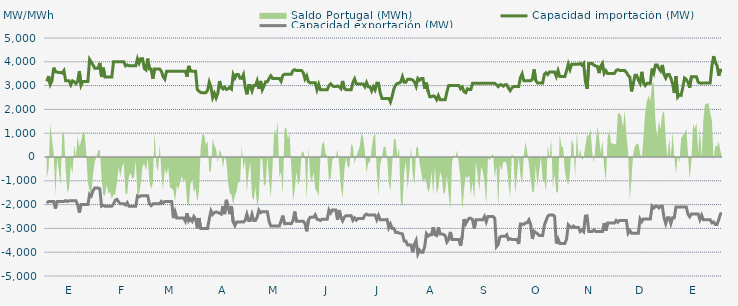
| Category | Capacidad importación (MW) | Capacidad exportación (MW) |
|---|---|---|
| 0 | 3175 | -1941.667 |
| 1900-01-01 | 3400 | -1866.667 |
| 1900-01-02 | 3047.917 | -1866.667 |
| 1900-01-03 | 3200 | -1866.667 |
| 1900-01-04 | 3754.167 | -1866.667 |
| 1900-01-05 | 3581.25 | -2166.667 |
| 1900-01-06 | 3566.667 | -1866.667 |
| 1900-01-07 | 3554.167 | -1866.667 |
| 1900-01-08 | 3554.167 | -1866.667 |
| 1900-01-09 | 3525 | -1866.667 |
| 1900-01-10 | 3629.167 | -1866.667 |
| 1900-01-11 | 3200 | -1833.333 |
| 1900-01-12 | 3200 | -1870.833 |
| 1900-01-13 | 3200 | -1833.333 |
| 1900-01-14 | 3031.25 | -1833.333 |
| 1900-01-15 | 3200 | -1833.333 |
| 1900-01-16 | 3162.5 | -1833.333 |
| 1900-01-17 | 3083.333 | -1833.333 |
| 1900-01-18 | 3175 | -2000 |
| 1900-01-19 | 3608.333 | -2337.5 |
| 1900-01-20 | 3016.667 | -2000 |
| 1900-01-21 | 3175 | -2000 |
| 1900-01-22 | 3175 | -2000 |
| 1900-01-23 | 3175 | -2000 |
| 1900-01-24 | 3175 | -2000 |
| 1900-01-25 | 4100 | -1566.667 |
| 1900-01-26 | 3987.5 | -1641.667 |
| 1900-01-27 | 3864.583 | -1425 |
| 1900-01-28 | 3733.333 | -1300 |
| 1900-01-29 | 3733.333 | -1300 |
| 1900-01-30 | 3733.333 | -1300 |
| 1900-01-31 | 3952.083 | -1341.667 |
| 1900-02-01 | 3362.5 | -2066.667 |
| 1900-02-02 | 3752.083 | -2029.167 |
| 1900-02-03 | 3362.5 | -2066.667 |
| 1900-02-04 | 3362.5 | -2066.667 |
| 1900-02-05 | 3362.5 | -2066.667 |
| 1900-02-06 | 3362.5 | -2066.667 |
| 1900-02-07 | 3362.5 | -2066.667 |
| 1900-02-08 | 4000 | -1966.667 |
| 1900-02-09 | 4000 | -1816.667 |
| 1900-02-10 | 4000 | -1779.167 |
| 1900-02-11 | 4000 | -1891.667 |
| 1900-02-12 | 4000 | -1966.667 |
| 1900-02-13 | 4000 | -1966.667 |
| 1900-02-14 | 4000 | -1966.667 |
| 1900-02-15 | 3829.167 | -2016.667 |
| 1900-02-16 | 3870.833 | -1916.667 |
| 1900-02-17 | 3829.167 | -2066.667 |
| 1900-02-18 | 3829.167 | -2066.667 |
| 1900-02-19 | 3829.167 | -2066.667 |
| 1900-02-20 | 3829.167 | -2066.667 |
| 1900-02-21 | 3829.167 | -2066.667 |
| 1900-02-22 | 4133.333 | -1633.333 |
| 1900-02-23 | 3945.833 | -1670.833 |
| 1900-02-24 | 4133.333 | -1633.333 |
| 1900-02-25 | 4133.333 | -1633.333 |
| 1900-02-26 | 3716.667 | -1633.333 |
| 1900-02-27 | 3658.333 | -1633.333 |
| 1900-02-28 | 4133.333 | -1633.333 |
| 1900-02-28 | 3700 | -1966.667 |
| 1900-03-01 | 3700 | -2041.667 |
| 1900-03-02 | 3283.333 | -1966.667 |
| 1900-03-03 | 3700 | -1966.667 |
| 1900-03-04 | 3700 | -1966.667 |
| 1900-03-05 | 3700 | -1966.667 |
| 1900-03-06 | 3700 | -1966.667 |
| 1900-03-07 | 3600 | -1866.667 |
| 1900-03-08 | 3375 | -1941.667 |
| 1900-03-09 | 3270.833 | -1866.667 |
| 1900-03-10 | 3600 | -1866.667 |
| 1900-03-11 | 3600 | -1866.667 |
| 1900-03-12 | 3600 | -1866.667 |
| 1900-03-13 | 3600 | -1866.667 |
| 1900-03-14 | 3600 | -2566.667 |
| 1900-03-15 | 3600 | -2304.167 |
| 1900-03-16 | 3600 | -2566.667 |
| 1900-03-17 | 3600 | -2566.667 |
| 1900-03-18 | 3600 | -2566.667 |
| 1900-03-19 | 3600 | -2566.667 |
| 1900-03-20 | 3600 | -2566.667 |
| 1900-03-21 | 3600 | -2700 |
| 1900-03-22 | 3375 | -2362.5 |
| 1900-03-23 | 3829.167 | -2687.5 |
| 1900-03-24 | 3616.667 | -2600 |
| 1900-03-25 | 3600 | -2700 |
| 1900-03-26 | 3600 | -2500 |
| 1900-03-27 | 3600 | -2612.5 |
| 1900-03-28 | 2833.333 | -3000 |
| 1900-03-29 | 2760.87 | -2565.217 |
| 1900-03-30 | 2708.333 | -3000 |
| 1900-03-31 | 2700 | -3000 |
| 1900-04-01 | 2700 | -3000 |
| 1900-04-02 | 2700 | -3000 |
| 1900-04-03 | 2800 | -3000 |
| 1900-04-04 | 3150 | -2600 |
| 1900-04-05 | 2945.833 | -2262.5 |
| 1900-04-06 | 2495.833 | -2412.5 |
| 1900-04-07 | 2675 | -2333.333 |
| 1900-04-08 | 2479.167 | -2308.333 |
| 1900-04-09 | 2675 | -2333.333 |
| 1900-04-10 | 3191.667 | -2358.333 |
| 1900-04-11 | 2933.333 | -2400 |
| 1900-04-12 | 2858.333 | -2062.5 |
| 1900-04-13 | 2933.333 | -2400 |
| 1900-04-14 | 2839.583 | -1800 |
| 1900-04-15 | 2864.583 | -2091.667 |
| 1900-04-16 | 2933.333 | -2400 |
| 1900-04-17 | 2858.333 | -2062.5 |
| 1900-04-18 | 3466.667 | -2733.333 |
| 1900-04-19 | 3316.667 | -2883.333 |
| 1900-04-20 | 3466.667 | -2733.333 |
| 1900-04-21 | 3466.667 | -2733.333 |
| 1900-04-22 | 3310.417 | -2733.333 |
| 1900-04-23 | 3306.25 | -2716.667 |
| 1900-04-24 | 3466.667 | -2733.333 |
| 1900-04-25 | 2933.333 | -2666.667 |
| 1900-04-26 | 2633.333 | -2404.167 |
| 1900-04-27 | 3000 | -2666.667 |
| 1900-04-28 | 3000 | -2666.667 |
| 1900-04-29 | 2775 | -2404.167 |
| 1900-04-30 | 3000 | -2666.667 |
| 1900-05-01 | 3000 | -2666.667 |
| 1900-05-02 | 3200 | -2533.333 |
| 1900-05-03 | 2862.5 | -2233.333 |
| 1900-05-04 | 3195.833 | -2341.667 |
| 1900-05-05 | 2822.917 | -2300 |
| 1900-05-06 | 2983.333 | -2300 |
| 1900-05-07 | 3166.667 | -2300 |
| 1900-05-08 | 3166.667 | -2300 |
| 1900-05-09 | 3300 | -2712.5 |
| 1900-05-10 | 3412.5 | -2900 |
| 1900-05-11 | 3300 | -2900 |
| 1900-05-12 | 3300 | -2900 |
| 1900-05-13 | 3300 | -2900 |
| 1900-05-14 | 3300 | -2900 |
| 1900-05-15 | 3300 | -2900 |
| 1900-05-16 | 3179.167 | -2687.5 |
| 1900-05-17 | 3425 | -2462.5 |
| 1900-05-18 | 3479.167 | -2800 |
| 1900-05-19 | 3479.167 | -2800 |
| 1900-05-20 | 3479.167 | -2791.667 |
| 1900-05-21 | 3479.167 | -2800 |
| 1900-05-22 | 3479.167 | -2800 |
| 1900-05-23 | 3633.333 | -2666.667 |
| 1900-05-24 | 3670.833 | -2291.667 |
| 1900-05-25 | 3633.333 | -2700 |
| 1900-05-26 | 3633.333 | -2700 |
| 1900-05-27 | 3633.333 | -2700 |
| 1900-05-28 | 3633.333 | -2700 |
| 1900-05-29 | 3541.667 | -2695.833 |
| 1900-05-30 | 3275 | -2800 |
| 1900-05-31 | 3412.5 | -3120.833 |
| 1900-06-01 | 3158.333 | -2650 |
| 1900-06-02 | 3116.667 | -2533.333 |
| 1900-06-03 | 3116.667 | -2533.333 |
| 1900-06-04 | 3116.667 | -2533.333 |
| 1900-06-05 | 3116.667 | -2429.167 |
| 1900-06-06 | 2825 | -2612.5 |
| 1900-06-07 | 3054.167 | -2633.333 |
| 1900-06-08 | 2825 | -2668.75 |
| 1900-06-09 | 2825 | -2612.5 |
| 1900-06-10 | 2825 | -2612.5 |
| 1900-06-11 | 2825 | -2612.5 |
| 1900-06-12 | 2825 | -2612.5 |
| 1900-06-13 | 2995.833 | -2229.167 |
| 1900-06-14 | 3075 | -2352.083 |
| 1900-06-15 | 2995.833 | -2229.167 |
| 1900-06-16 | 2958.333 | -2229.167 |
| 1900-06-17 | 2958.333 | -2229.167 |
| 1900-06-18 | 2981.25 | -2641.667 |
| 1900-06-19 | 2958.333 | -2229.167 |
| 1900-06-20 | 2875 | -2533.333 |
| 1900-06-21 | 3195.833 | -2683.333 |
| 1900-06-22 | 2875 | -2525 |
| 1900-06-23 | 2825 | -2466.667 |
| 1900-06-24 | 2825 | -2466.667 |
| 1900-06-25 | 2825 | -2466.667 |
| 1900-06-26 | 2825 | -2466.667 |
| 1900-06-27 | 3129.167 | -2658.333 |
| 1900-06-28 | 3283.333 | -2558.333 |
| 1900-06-29 | 3081.25 | -2654.167 |
| 1900-06-30 | 3062.5 | -2587.5 |
| 1900-07-01 | 3062.5 | -2587.5 |
| 1900-07-02 | 3062.5 | -2587.5 |
| 1900-07-03 | 3062.5 | -2587.5 |
| 1900-07-04 | 2950 | -2441.667 |
| 1900-07-05 | 3133.333 | -2400 |
| 1900-07-06 | 2950 | -2441.667 |
| 1900-07-07 | 2950 | -2441.667 |
| 1900-07-08 | 2775 | -2441.667 |
| 1900-07-09 | 2950 | -2441.667 |
| 1900-07-10 | 2818.75 | -2441.667 |
| 1900-07-11 | 3104.167 | -2637.5 |
| 1900-07-12 | 3100 | -2452.083 |
| 1900-07-13 | 2697.917 | -2637.5 |
| 1900-07-14 | 2462.5 | -2637.5 |
| 1900-07-15 | 2462.5 | -2637.5 |
| 1900-07-16 | 2462.5 | -2637.5 |
| 1900-07-17 | 2462.5 | -2625 |
| 1900-07-18 | 2462.5 | -2975 |
| 1900-07-19 | 2310.417 | -2816.667 |
| 1900-07-20 | 2562.5 | -3000 |
| 1900-07-21 | 2862.5 | -3000 |
| 1900-07-22 | 3025 | -3170.833 |
| 1900-07-23 | 3087.5 | -3158.333 |
| 1900-07-24 | 3106.25 | -3195.833 |
| 1900-07-25 | 3154.167 | -3212.917 |
| 1900-07-26 | 3377.083 | -3233.333 |
| 1900-07-27 | 3145.833 | -3533.333 |
| 1900-07-28 | 3145.833 | -3533.333 |
| 1900-07-29 | 3262.5 | -3700 |
| 1900-07-30 | 3262.5 | -3700 |
| 1900-07-31 | 3262.5 | -3700 |
| 1900-08-01 | 3233.333 | -4000 |
| 1900-08-02 | 3158.333 | -3662.5 |
| 1900-08-03 | 2970.833 | -3504.167 |
| 1900-08-04 | 3300 | -4075 |
| 1900-08-05 | 3225 | -3912.5 |
| 1900-08-06 | 3300 | -4000 |
| 1900-08-07 | 3300 | -4000 |
| 1900-08-08 | 2866.667 | -3766.667 |
| 1900-08-09 | 3125 | -3222.917 |
| 1900-08-10 | 2754.167 | -3325 |
| 1900-08-11 | 2533.333 | -3266.667 |
| 1900-08-12 | 2533.333 | -3266.667 |
| 1900-08-13 | 2570.833 | -2947.917 |
| 1900-08-14 | 2533.333 | -3266.667 |
| 1900-08-15 | 2408.333 | -3300 |
| 1900-08-16 | 2583.333 | -2962.5 |
| 1900-08-17 | 2408.333 | -3237.5 |
| 1900-08-18 | 2408.333 | -3233.333 |
| 1900-08-19 | 2408.333 | -3254.167 |
| 1900-08-20 | 2408.333 | -3300 |
| 1900-08-21 | 2729.167 | -3575 |
| 1900-08-22 | 3000 | -3466.667 |
| 1900-08-23 | 3000 | -3147.917 |
| 1900-08-24 | 3000 | -3466.667 |
| 1900-08-25 | 3000 | -3466.667 |
| 1900-08-26 | 3000 | -3466.667 |
| 1900-08-27 | 3000 | -3466.667 |
| 1900-08-28 | 3000 | -3466.667 |
| 1900-08-29 | 2866.667 | -3733.333 |
| 1900-08-30 | 2941.667 | -3320.833 |
| 1900-08-31 | 2741.667 | -2608.333 |
| 1900-09-01 | 2700 | -2808.333 |
| 1900-09-02 | 2866.667 | -2670.833 |
| 1900-09-03 | 2833.333 | -2575 |
| 1900-09-04 | 2833.333 | -2575 |
| 1900-09-05 | 3100 | -2633.333 |
| 1900-09-06 | 3100 | -3008.333 |
| 1900-09-07 | 3100 | -2633.333 |
| 1900-09-08 | 3100 | -2633.333 |
| 1900-09-09 | 3100 | -2633.333 |
| 1900-09-10 | 3100 | -2633.333 |
| 1900-09-11 | 3100 | -2633.333 |
| 1900-09-12 | 3100 | -2500 |
| 1900-09-13 | 3100 | -2725 |
| 1900-09-14 | 3100 | -2500 |
| 1900-09-15 | 3100 | -2500 |
| 1900-09-16 | 3100 | -2500 |
| 1900-09-17 | 3100 | -2500 |
| 1900-09-18 | 3100 | -2575 |
| 1900-09-19 | 3033.333 | -3766.667 |
| 1900-09-20 | 2958.333 | -3672.917 |
| 1900-09-21 | 3033.333 | -3360.417 |
| 1900-09-22 | 3033.333 | -3333.333 |
| 1900-09-23 | 2976.875 | -3333.333 |
| 1900-09-24 | 3033.333 | -3333.333 |
| 1900-09-25 | 3033.333 | -3266.667 |
| 1900-09-26 | 2900 | -3466.667 |
| 1900-09-27 | 2787.5 | -3429.167 |
| 1900-09-28 | 2900 | -3466.667 |
| 1900-09-29 | 2966.667 | -3466.667 |
| 1900-09-30 | 2966.667 | -3466.667 |
| 1900-10-01 | 2966.667 | -3466.667 |
| 1900-10-02 | 2966.667 | -3654.167 |
| 1900-10-03 | 3335.417 | -2816.667 |
| 1900-10-04 | 3495.833 | -2816.667 |
| 1900-10-05 | 3204.167 | -2833.333 |
| 1900-10-06 | 3204.167 | -2766.667 |
| 1900-10-07 | 3204.167 | -2766.667 |
| 1900-10-08 | 3204.167 | -2641.667 |
| 1900-10-09 | 3204.167 | -2833.333 |
| 1900-10-10 | 3266.667 | -3443.75 |
| 1900-10-11 | 3679.167 | -3122.917 |
| 1900-10-12 | 3208.333 | -3179.167 |
| 1900-10-13 | 3108.333 | -3225 |
| 1900-10-14 | 3108.333 | -3300 |
| 1900-10-15 | 3108.333 | -3300 |
| 1900-10-16 | 3108.333 | -3300 |
| 1900-10-17 | 3466.667 | -2866.667 |
| 1900-10-18 | 3541.667 | -2672.5 |
| 1900-10-19 | 3466.667 | -2487.5 |
| 1900-10-20 | 3570.833 | -2433.333 |
| 1900-10-21 | 3570.833 | -2433.333 |
| 1900-10-22 | 3570.833 | -2433.333 |
| 1900-10-23 | 3570.833 | -2491.667 |
| 1900-10-24 | 3383.333 | -3633.333 |
| 1900-10-25 | 3632 | -3440 |
| 1900-10-26 | 3383.333 | -3633.333 |
| 1900-10-27 | 3383.333 | -3633.333 |
| 1900-10-28 | 3383.333 | -3633.333 |
| 1900-10-29 | 3383.333 | -3633.333 |
| 1900-10-30 | 3625 | -3445.833 |
| 1900-10-31 | 3900 | -2849.25 |
| 1900-11-01 | 3675 | -2929.167 |
| 1900-11-02 | 3900 | -2966.667 |
| 1900-11-03 | 3900 | -2900 |
| 1900-11-04 | 3900 | -2966.667 |
| 1900-11-05 | 3900 | -2966.667 |
| 1900-11-06 | 3900 | -2966.667 |
| 1900-11-07 | 3933.333 | -3133.333 |
| 1900-11-08 | 3858.333 | -3058.333 |
| 1900-11-09 | 3933.333 | -3133.333 |
| 1900-11-10 | 3175 | -2483.333 |
| 1900-11-11 | 2862.5 | -2475 |
| 1900-11-12 | 3933.333 | -3133.333 |
| 1900-11-13 | 3933.333 | -3133.333 |
| 1900-11-14 | 3933.333 | -3133.333 |
| 1900-11-15 | 3858.333 | -3058.333 |
| 1900-11-16 | 3825 | -3133.333 |
| 1900-11-17 | 3808.333 | -3133.333 |
| 1900-11-18 | 3525 | -3133.333 |
| 1900-11-19 | 3816.708 | -3133.333 |
| 1900-11-20 | 3933.333 | -3133.333 |
| 1900-11-21 | 3512.5 | -2775 |
| 1900-11-22 | 3627.083 | -3095.833 |
| 1900-11-23 | 3512.5 | -2775 |
| 1900-11-24 | 3512.5 | -2775 |
| 1900-11-25 | 3512.5 | -2775 |
| 1900-11-26 | 3512.5 | -2775 |
| 1900-11-27 | 3512.5 | -2775 |
| 1900-11-28 | 3633.333 | -2666.667 |
| 1900-11-29 | 3670.833 | -2741.667 |
| 1900-11-30 | 3633.333 | -2666.667 |
| 1900-12-01 | 3633.333 | -2666.667 |
| 1900-12-02 | 3633.333 | -2666.667 |
| 1900-12-03 | 3633.333 | -2666.667 |
| 1900-12-04 | 3557.083 | -2666.667 |
| 1900-12-05 | 3433.333 | -3200 |
| 1900-12-06 | 3358.333 | -3087.5 |
| 1900-12-07 | 2756.25 | -3200 |
| 1900-12-08 | 3066.667 | -3200 |
| 1900-12-09 | 3433.333 | -3200 |
| 1900-12-10 | 3433.333 | -3200 |
| 1900-12-11 | 3232.417 | -3200 |
| 1900-12-12 | 3100 | -2600 |
| 1900-12-13 | 3579.167 | -2712.5 |
| 1900-12-14 | 3100 | -2600 |
| 1900-12-15 | 3000.75 | -2600 |
| 1900-12-16 | 3100 | -2600 |
| 1900-12-17 | 3100 | -2600 |
| 1900-12-18 | 3100 | -2600 |
| 1900-12-19 | 3712.917 | -2066.667 |
| 1900-12-20 | 3527.083 | -2141.667 |
| 1900-12-21 | 3866.667 | -2066.667 |
| 1900-12-22 | 3866.667 | -2066.667 |
| 1900-12-23 | 3716.667 | -2141.667 |
| 1900-12-24 | 3616.667 | -2066.667 |
| 1900-12-25 | 3866.667 | -2066.667 |
| 1900-12-26 | 3466.667 | -2550 |
| 1900-12-27 | 3316.667 | -2795.833 |
| 1900-12-28 | 3466.667 | -2550 |
| 1900-12-29 | 3466.667 | -2550 |
| 1900-12-30 | 3316.667 | -2795.833 |
| 1900-12-31 | 3082.167 | -2550 |
| 1901-01-01 | 2687.5 | -2550 |
| 1901-01-02 | 3400 | -2100 |
| 1901-01-03 | 2520.833 | -2100 |
| 1901-01-04 | 2614.583 | -2100 |
| 1901-01-05 | 2591.25 | -2100 |
| 1901-01-06 | 2932.083 | -2100 |
| 1901-01-07 | 3318.75 | -2100 |
| 1901-01-08 | 3262.5 | -2100 |
| 1901-01-09 | 3139.583 | -2400 |
| 1901-01-10 | 2912.5 | -2512.5 |
| 1901-01-11 | 3366.667 | -2400 |
| 1901-01-12 | 3366.667 | -2400 |
| 1901-01-13 | 3366.667 | -2400 |
| 1901-01-14 | 3366.667 | -2400 |
| 1901-01-15 | 3139.583 | -2400 |
| 1901-01-16 | 3108.333 | -2633.333 |
| 1901-01-17 | 3100 | -2445.833 |
| 1901-01-18 | 3108.333 | -2633.333 |
| 1901-01-19 | 3108.333 | -2633.333 |
| 1901-01-20 | 3108.333 | -2633.333 |
| 1901-01-21 | 3108.333 | -2633.333 |
| 1901-01-22 | 3108.333 | -2633.333 |
| 1901-01-23 | 3822.917 | -2766.667 |
| 1901-01-24 | 4239.583 | -2729.167 |
| 1901-01-25 | 3979.167 | -2833.333 |
| 1901-01-26 | 3841.667 | -2833.333 |
| 1901-01-27 | 3414.375 | -2634.375 |
| 1901-01-28 | 3652.5 | -2392.5 |
| 1901-01-29 | 3633.75 | -2364.375 |